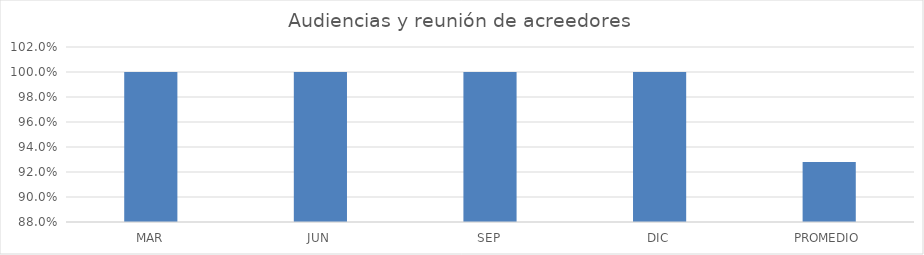
| Category | Series 0 |
|---|---|
| MAR | 1 |
| JUN | 1 |
| SEP | 1 |
| DIC | 1 |
| PROMEDIO | 0.928 |